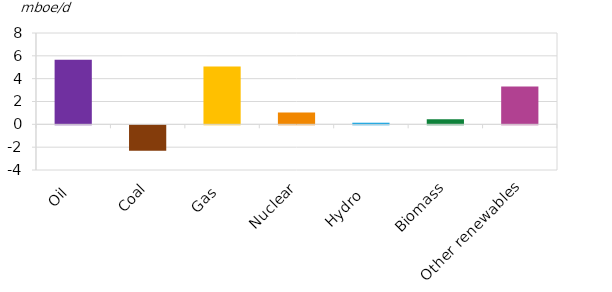
| Category | 2045 |
|---|---|
| Oil | 5.651 |
| Coal | -2.223 |
| Gas | 5.063 |
| Nuclear | 1.044 |
| Hydro  | 0.129 |
| Biomass | 0.454 |
| Other renewables | 3.321 |